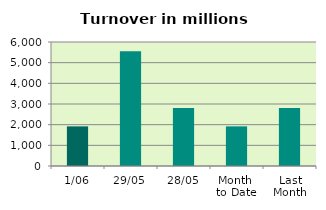
| Category | Series 0 |
|---|---|
| 1/06 | 1917.88 |
| 29/05 | 5553.916 |
| 28/05 | 2801.751 |
| Month 
to Date | 1917.88 |
| Last
Month | 2802.964 |